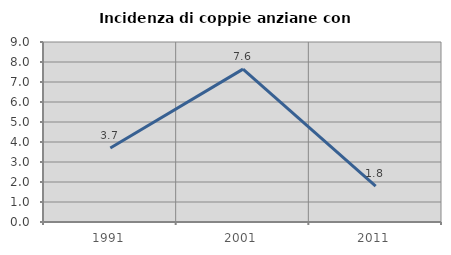
| Category | Incidenza di coppie anziane con figli |
|---|---|
| 1991.0 | 3.704 |
| 2001.0 | 7.643 |
| 2011.0 | 1.796 |